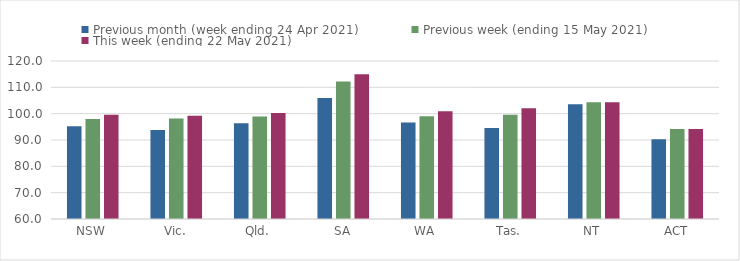
| Category | Previous month (week ending 24 Apr 2021) | Previous week (ending 15 May 2021) | This week (ending 22 May 2021) |
|---|---|---|---|
| NSW | 95.25 | 97.99 | 99.57 |
| Vic. | 93.84 | 98.18 | 99.23 |
| Qld. | 96.36 | 98.92 | 100.29 |
| SA | 105.98 | 112.26 | 115.01 |
| WA | 96.63 | 99.05 | 100.89 |
| Tas. | 94.54 | 99.58 | 102.06 |
| NT | 103.6 | 104.38 | 104.38 |
| ACT | 90.31 | 94.16 | 94.16 |